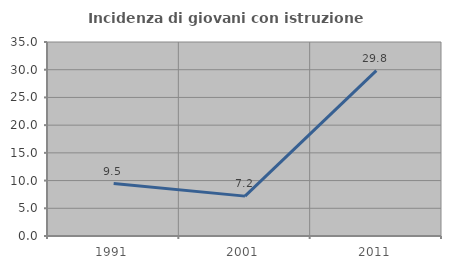
| Category | Incidenza di giovani con istruzione universitaria |
|---|---|
| 1991.0 | 9.467 |
| 2001.0 | 7.194 |
| 2011.0 | 29.825 |